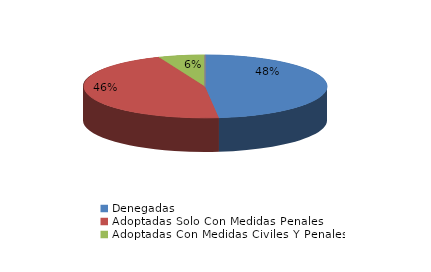
| Category | Series 0 |
|---|---|
| Denegadas | 94 |
| Adoptadas Solo Con Medidas Penales | 89 |
| Adoptadas Con Medidas Civiles Y Penales | 12 |
| Adoptadas Con Medidas Solo Civiles | 0 |